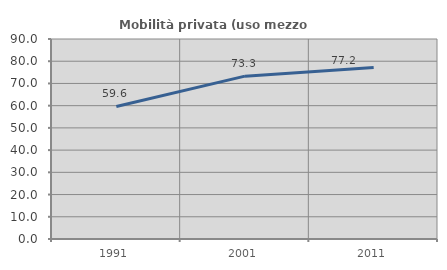
| Category | Mobilità privata (uso mezzo privato) |
|---|---|
| 1991.0 | 59.636 |
| 2001.0 | 73.276 |
| 2011.0 | 77.209 |